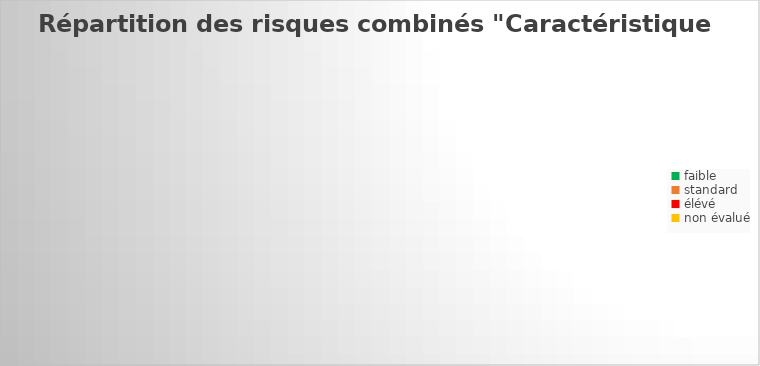
| Category | Series 1 |
|---|---|
| faible | 0 |
| standard | 0 |
| élévé | 0 |
| non évalué | 0 |